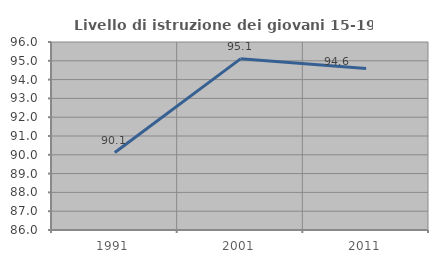
| Category | Livello di istruzione dei giovani 15-19 anni |
|---|---|
| 1991.0 | 90.122 |
| 2001.0 | 95.104 |
| 2011.0 | 94.595 |